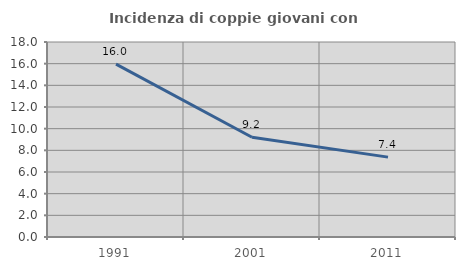
| Category | Incidenza di coppie giovani con figli |
|---|---|
| 1991.0 | 15.963 |
| 2001.0 | 9.206 |
| 2011.0 | 7.374 |